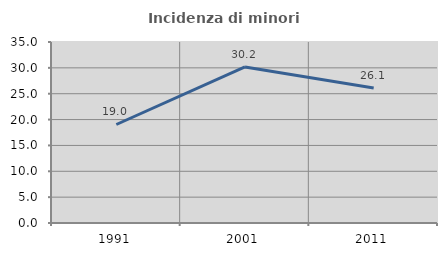
| Category | Incidenza di minori stranieri |
|---|---|
| 1991.0 | 19.048 |
| 2001.0 | 30.172 |
| 2011.0 | 26.099 |